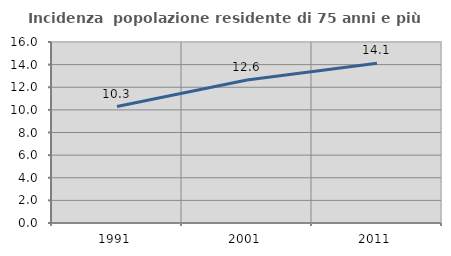
| Category | Incidenza  popolazione residente di 75 anni e più |
|---|---|
| 1991.0 | 10.298 |
| 2001.0 | 12.64 |
| 2011.0 | 14.119 |